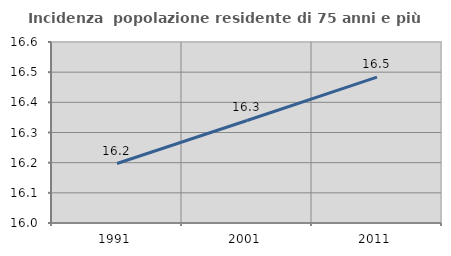
| Category | Incidenza  popolazione residente di 75 anni e più |
|---|---|
| 1991.0 | 16.197 |
| 2001.0 | 16.34 |
| 2011.0 | 16.484 |